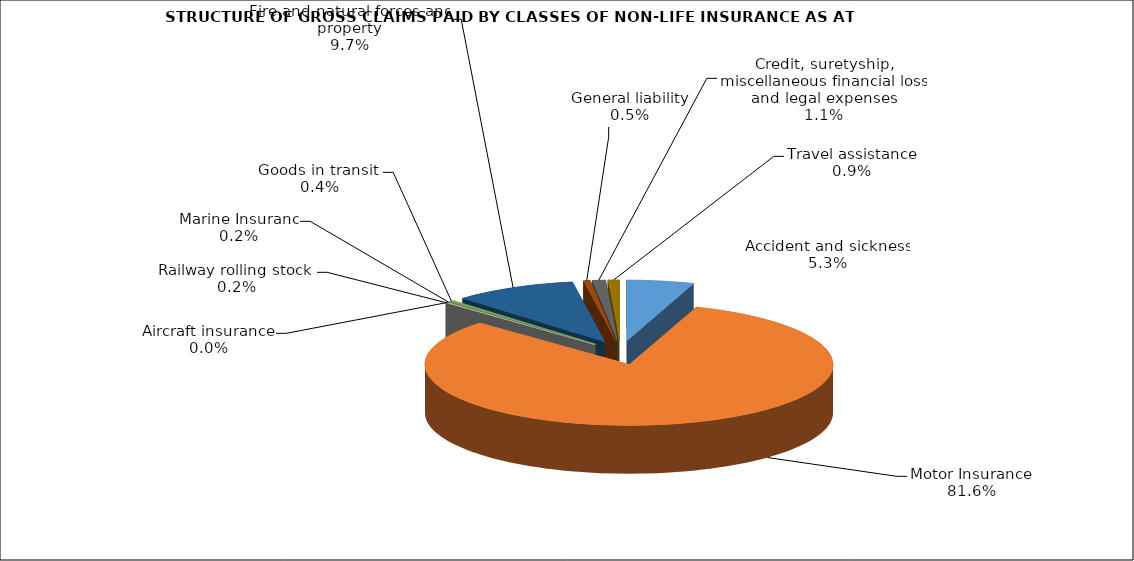
| Category | Accident and sickness | Series 1 |
|---|---|---|
| Accident and sickness | 0.053 |  |
| Motor Insurance | 0.816 |  |
| Railway rolling stock  | 0.002 |  |
| Aircraft insurance | 0 |  |
| Marine Insuranc | 0.002 |  |
| Goods in transit  | 0.004 |  |
| Fire and natural forces and property | 0.097 |  |
| General liability | 0.005 |  |
| Credit, suretyship, miscellaneous financial loss and legal expenses | 0.011 |  |
| Travel assistance | 0.009 |  |